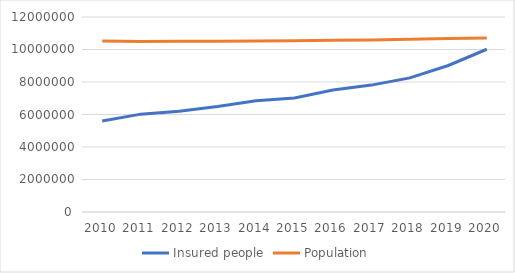
| Category | Insured people | Population |
|---|---|---|
| 2010.0 | 5602281 | 10517247 |
| 2011.0 | 6022448 | 10496672 |
| 2012.0 | 6204489 | 10509286 |
| 2013.0 | 6490744 | 10510719 |
| 2014.0 | 6844178 | 10524783 |
| 2015.0 | 7012254 | 10542942 |
| 2016.0 | 7504469 | 10565284 |
| 2017.0 | 7809088 | 10589526 |
| 2018.0 | 8254416 | 10626430 |
| 2019.0 | 9015526 | 10669324 |
| 2020.0 | 10015088 | 10700155 |